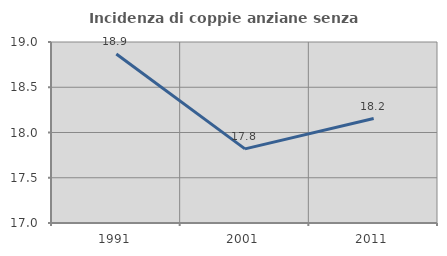
| Category | Incidenza di coppie anziane senza figli  |
|---|---|
| 1991.0 | 18.868 |
| 2001.0 | 17.819 |
| 2011.0 | 18.154 |